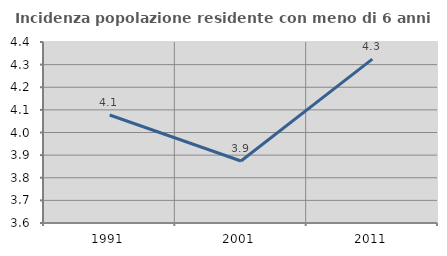
| Category | Incidenza popolazione residente con meno di 6 anni |
|---|---|
| 1991.0 | 4.077 |
| 2001.0 | 3.874 |
| 2011.0 | 4.324 |